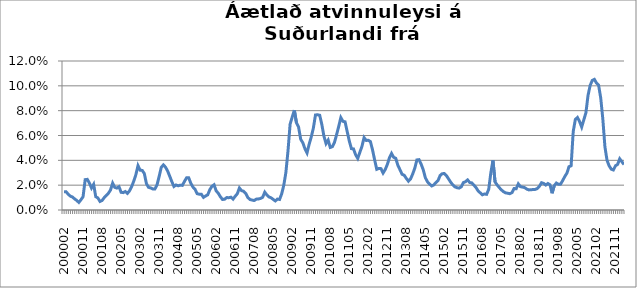
| Category | Series 0 |
|---|---|
| 200002 | 0.015 |
| 200003 | 0.015 |
| 200004 | 0.013 |
| 200005 | 0.011 |
| 200006 | 0.01 |
| 200007 | 0.009 |
| 200008 | 0.008 |
| 200009 | 0.006 |
| 200010 | 0.008 |
| 200011 | 0.011 |
| 200012 | 0.024 |
| 200101 | 0.025 |
| 200102 | 0.022 |
| 200103 | 0.018 |
| 200104 | 0.021 |
| 200105 | 0.011 |
| 200106 | 0.01 |
| 200107 | 0.007 |
| 200108 | 0.008 |
| 200109 | 0.01 |
| 200110 | 0.012 |
| 200111 | 0.014 |
| 200112 | 0.016 |
| 200201 | 0.022 |
| 200202 | 0.018 |
| 200203 | 0.018 |
| 200204 | 0.019 |
| 200205 | 0.014 |
| 200206 | 0.014 |
| 200207 | 0.015 |
| 200208 | 0.013 |
| 200209 | 0.015 |
| 200210 | 0.019 |
| 200211 | 0.023 |
| 200212 | 0.029 |
| 200301 | 0.036 |
| 200302 | 0.032 |
| 200303 | 0.032 |
| 200304 | 0.029 |
| 200305 | 0.021 |
| 200306 | 0.018 |
| 200307 | 0.018 |
| 200308 | 0.017 |
| 200309 | 0.017 |
| 200310 | 0.02 |
| 200311 | 0.027 |
| 200312 | 0.034 |
| 200401 | 0.036 |
| 200402 | 0.035 |
| 200403 | 0.031 |
| 200404 | 0.027 |
| 200405 | 0.023 |
| 200406 | 0.019 |
| 200407 | 0.02 |
| 200408 | 0.019 |
| 200409 | 0.02 |
| 200410 | 0.02 |
| 200411 | 0.023 |
| 200412 | 0.026 |
| 200501 | 0.026 |
| 200502 | 0.022 |
| 200503 | 0.018 |
| 200504 | 0.017 |
| 200505 | 0.013 |
| 200506 | 0.013 |
| 200507 | 0.013 |
| 200508 | 0.01 |
| 200509 | 0.011 |
| 200510 | 0.012 |
| 200511 | 0.016 |
| 200512 | 0.019 |
| 200601 | 0.02 |
| 200602 | 0.015 |
| 200603 | 0.013 |
| 200604 | 0.011 |
| 200605 | 0.008 |
| 200606 | 0.009 |
| 200607 | 0.01 |
| 200608 | 0.01 |
| 200609 | 0.01 |
| 200610 | 0.009 |
| 200611 | 0.011 |
| 200612 | 0.013 |
| 200701 | 0.018 |
| 200702 | 0.016 |
| 200703 | 0.015 |
| 200704 | 0.013 |
| 200705 | 0.01 |
| 200706 | 0.008 |
| 200707 | 0.008 |
| 200708 | 0.008 |
| 200709 | 0.009 |
| 200710 | 0.009 |
| 200711 | 0.009 |
| 200712 | 0.01 |
| 200801 | 0.014 |
| 200802 | 0.012 |
| 200803 | 0.011 |
| 200804 | 0.01 |
| 200805 | 0.008 |
| 200806 | 0.007 |
| 200807 | 0.009 |
| 200808 | 0.008 |
| 200809 | 0.013 |
| 200810 | 0.02 |
| 200811 | 0.03 |
| 200812 | 0.048 |
| 200901 | 0.069 |
| 200902 | 0.075 |
| 200903 | 0.08 |
| 200904 | 0.07 |
| 200905 | 0.067 |
| 200906 | 0.057 |
| 200907 | 0.054 |
| 200908 | 0.049 |
| 200909 | 0.046 |
| 200910 | 0.053 |
| 200911 | 0.059 |
| 200912 | 0.066 |
| 201001 | 0.077 |
| 201002 | 0.077 |
| 201003 | 0.076 |
| 201004 | 0.069 |
| 201005 | 0.059 |
| 201006 | 0.053 |
| 201007 | 0.056 |
| 201008 | 0.05 |
| 201009 | 0.051 |
| 201010 | 0.054 |
| 201011 | 0.061 |
| 201012 | 0.067 |
| 201101 | 0.074 |
| 201102 | 0.071 |
| 201103 | 0.071 |
| 201104 | 0.063 |
| 201105 | 0.056 |
| 201106 | 0.049 |
| 201107 | 0.049 |
| 201108 | 0.044 |
| 201109 | 0.042 |
| 201110 | 0.046 |
| 201111 | 0.051 |
| 201112 | 0.058 |
| 201201 | 0.056 |
| 201202 | 0.056 |
| 201203 | 0.055 |
| 201204 | 0.048 |
| 201205 | 0.04 |
| 201206 | 0.033 |
| 201207 | 0.033 |
| 201208 | 0.033 |
| 201209 | 0.03 |
| 201210 | 0.033 |
| 201211 | 0.037 |
| 201212 | 0.042 |
| 201301 | 0.046 |
| 201302 | 0.042 |
| 201303 | 0.042 |
| 201304 | 0.036 |
| 201305 | 0.032 |
| 201306 | 0.029 |
| 201307 | 0.028 |
| 201308 | 0.025 |
| 201309 | 0.023 |
| 201310 | 0.025 |
| 201311 | 0.029 |
| 201312 | 0.034 |
| 201401 | 0.04 |
| 201402 | 0.041 |
| 201403 | 0.037 |
| 201404 | 0.032 |
| 201405 | 0.026 |
| 201406 | 0.023 |
| 201407 | 0.021 |
| 201408 | 0.019 |
| 201409 | 0.02 |
| 201410 | 0.022 |
| 201411 | 0.024 |
| 201412 | 0.028 |
| 201501 | 0.029 |
| 201502 | 0.029 |
| 201503 | 0.028 |
| 201504 | 0.025 |
| 201505 | 0.022 |
| 201506 | 0.02 |
| 201507 | 0.019 |
| 201508 | 0.018 |
| 201509 | 0.018 |
| 201510 | 0.019 |
| 201511 | 0.022 |
| 201512 | 0.023 |
| 201601 | 0.024 |
| 201602 | 0.022 |
| 201603 | 0.022 |
| 201604 | 0.02 |
| 201605 | 0.018 |
| 201606 | 0.015 |
| 201607 | 0.014 |
| 201608 | 0.012 |
| 201609 | 0.013 |
| 201610 | 0.013 |
| 201611 | 0.017 |
| 201612 | 0.03 |
| 201701 | 0.04 |
| 201702 | 0.023 |
| 201703 | 0.02 |
| 201704 | 0.018 |
| 201705 | 0.016 |
| 201706 | 0.015 |
| 201707 | 0.014 |
| 201708 | 0.014 |
| 201709 | 0.013 |
| 201710 | 0.014 |
| 201711 | 0.017 |
| 201712 | 0.017 |
| 201801 | 0.021 |
| 201802 | 0.019 |
| 201803 | 0.018 |
| 201804 | 0.018 |
| 201805 | 0.017 |
| 201806 | 0.016 |
| 201807 | 0.016 |
| 201808 | 0.017 |
| 201809 | 0.017 |
| 201810 | 0.017 |
| 201811 | 0.019 |
| 201812 | 0.022 |
| 201901 | 0.021 |
| 201902 | 0.02 |
| 201903 | 0.021 |
| 201904 | 0.02 |
| 201905 | 0.013 |
| 201906 | 0.02 |
| 201907 | 0.022 |
| 201908 | 0.021 |
| 201909 | 0.021 |
| 201910 | 0.024 |
| 201911 | 0.027 |
| 201912 | 0.03 |
| 202001(a) | 0.035 |
| 202002 | 0.036 |
| 202003***  | 0.063 |
| 202004 | 0.073 |
| 202005 | 0.075 |
| 202006 | 0.071 |
| 202007 | 0.067 |
| 202008 | 0.073 |
| 202009 | 0.078 |
| 202010 | 0.092 |
| 202011 | 0.1 |
| 202012 | 0.104 |
| 202101 | 0.105 |
| 202102 | 0.102 |
| 202103 | 0.101 |
| 202104 | 0.09 |
| 202105 | 0.073 |
| 202106 | 0.051 |
| 202107 | 0.04 |
| 202108 | 0.036 |
| 202109 | 0.033 |
| 202110 | 0.032 |
| 202111 | 0.036 |
| 202112 | 0.037 |
| 202201 | 0.041 |
| 202202 | 0.039 |
| 202203 | 0.037 |